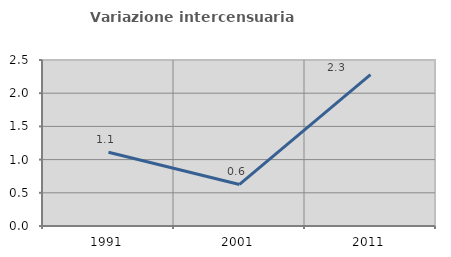
| Category | Variazione intercensuaria annua |
|---|---|
| 1991.0 | 1.11 |
| 2001.0 | 0.626 |
| 2011.0 | 2.28 |